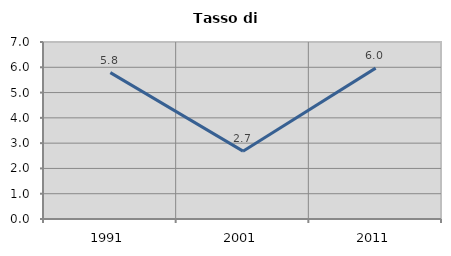
| Category | Tasso di disoccupazione   |
|---|---|
| 1991.0 | 5.789 |
| 2001.0 | 2.683 |
| 2011.0 | 5.967 |